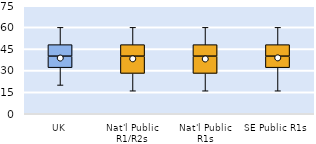
| Category | 25th | 50th | 75th |
|---|---|---|---|
| UK | 32 | 8 | 8 |
| Nat'l Public R1/R2s | 28 | 12 | 8 |
| Nat'l Public R1s | 28 | 12 | 8 |
| SE Public R1s | 32 | 8 | 8 |